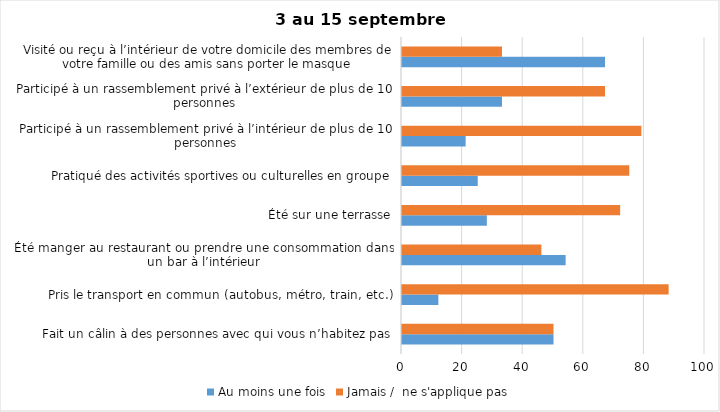
| Category | Au moins une fois | Jamais /  ne s'applique pas |
|---|---|---|
| Fait un câlin à des personnes avec qui vous n’habitez pas | 50 | 50 |
| Pris le transport en commun (autobus, métro, train, etc.) | 12 | 88 |
| Été manger au restaurant ou prendre une consommation dans un bar à l’intérieur | 54 | 46 |
| Été sur une terrasse | 28 | 72 |
| Pratiqué des activités sportives ou culturelles en groupe | 25 | 75 |
| Participé à un rassemblement privé à l’intérieur de plus de 10 personnes | 21 | 79 |
| Participé à un rassemblement privé à l’extérieur de plus de 10 personnes | 33 | 67 |
| Visité ou reçu à l’intérieur de votre domicile des membres de votre famille ou des amis sans porter le masque | 67 | 33 |